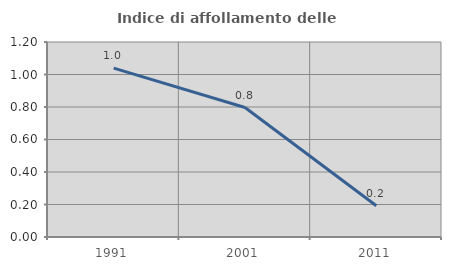
| Category | Indice di affollamento delle abitazioni  |
|---|---|
| 1991.0 | 1.04 |
| 2001.0 | 0.797 |
| 2011.0 | 0.193 |